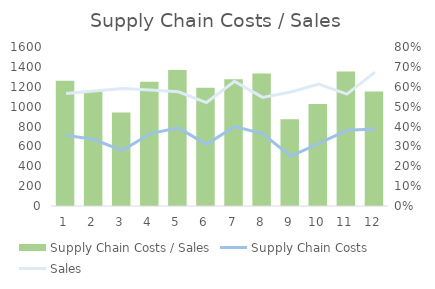
| Category | Supply Chain Costs / Sales |
|---|---|
| 0 | 0.63 |
| 1 | 0.578 |
| 2 | 0.471 |
| 3 | 0.625 |
| 4 | 0.684 |
| 5 | 0.596 |
| 6 | 0.638 |
| 7 | 0.666 |
| 8 | 0.436 |
| 9 | 0.513 |
| 10 | 0.677 |
| 11 | 0.576 |